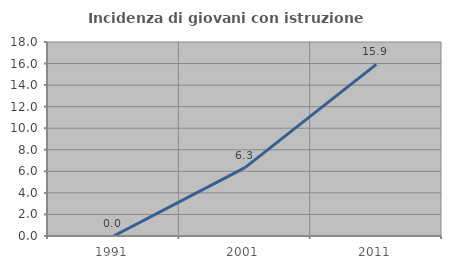
| Category | Incidenza di giovani con istruzione universitaria |
|---|---|
| 1991.0 | 0 |
| 2001.0 | 6.338 |
| 2011.0 | 15.929 |